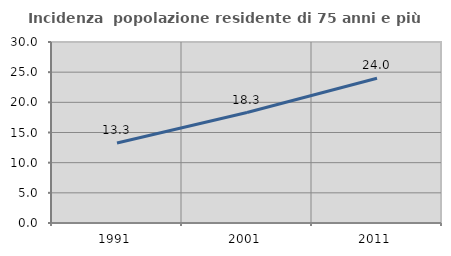
| Category | Incidenza  popolazione residente di 75 anni e più |
|---|---|
| 1991.0 | 13.265 |
| 2001.0 | 18.31 |
| 2011.0 | 23.981 |